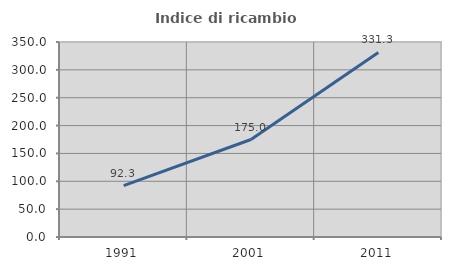
| Category | Indice di ricambio occupazionale  |
|---|---|
| 1991.0 | 92.308 |
| 2001.0 | 175 |
| 2011.0 | 331.25 |